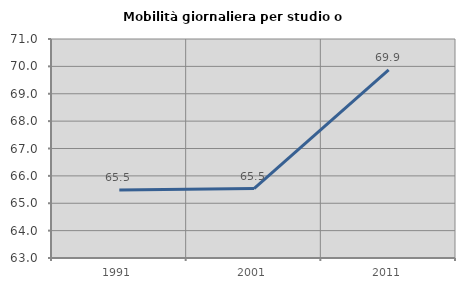
| Category | Mobilità giornaliera per studio o lavoro |
|---|---|
| 1991.0 | 65.482 |
| 2001.0 | 65.534 |
| 2011.0 | 69.876 |